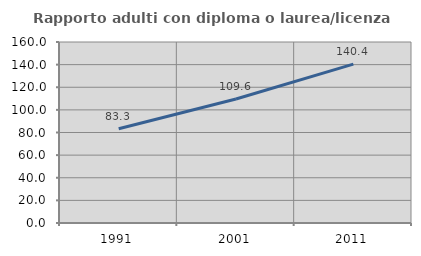
| Category | Rapporto adulti con diploma o laurea/licenza media  |
|---|---|
| 1991.0 | 83.294 |
| 2001.0 | 109.571 |
| 2011.0 | 140.399 |